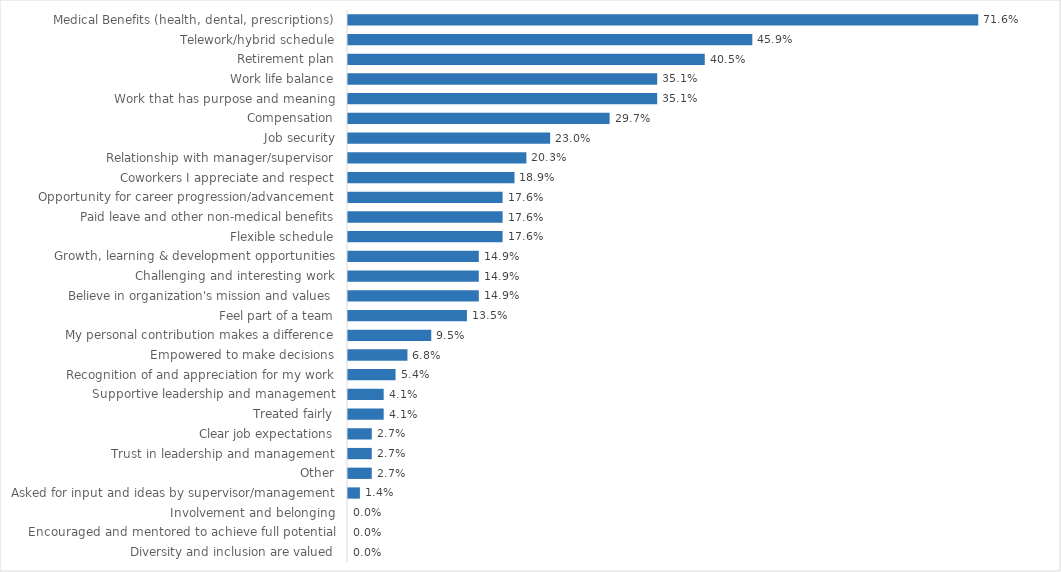
| Category | Commerce & Community Development |
|---|---|
| Medical Benefits (health, dental, prescriptions) | 0.716 |
| Telework/hybrid schedule | 0.459 |
| Retirement plan | 0.405 |
| Work life balance | 0.351 |
| Work that has purpose and meaning | 0.351 |
| Compensation | 0.297 |
| Job security | 0.23 |
| Relationship with manager/supervisor | 0.203 |
| Coworkers I appreciate and respect | 0.189 |
| Opportunity for career progression/advancement | 0.176 |
| Paid leave and other non-medical benefits | 0.176 |
| Flexible schedule | 0.176 |
| Growth, learning & development opportunities | 0.149 |
| Challenging and interesting work | 0.149 |
| Believe in organization's mission and values | 0.149 |
| Feel part of a team | 0.135 |
| My personal contribution makes a difference | 0.095 |
| Empowered to make decisions | 0.068 |
| Recognition of and appreciation for my work | 0.054 |
| Supportive leadership and management | 0.041 |
| Treated fairly | 0.041 |
| Clear job expectations | 0.027 |
| Trust in leadership and management | 0.027 |
| Other | 0.027 |
| Asked for input and ideas by supervisor/management | 0.014 |
| Involvement and belonging | 0 |
| Encouraged and mentored to achieve full potential | 0 |
| Diversity and inclusion are valued | 0 |